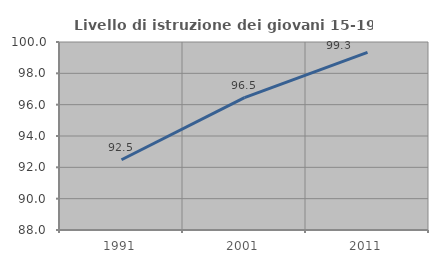
| Category | Livello di istruzione dei giovani 15-19 anni |
|---|---|
| 1991.0 | 92.482 |
| 2001.0 | 96.45 |
| 2011.0 | 99.341 |